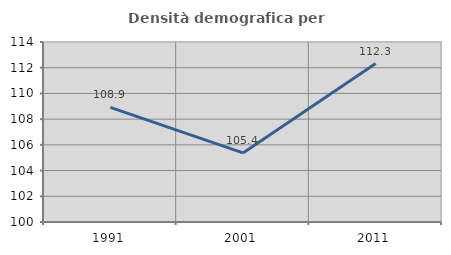
| Category | Densità demografica |
|---|---|
| 1991.0 | 108.913 |
| 2001.0 | 105.374 |
| 2011.0 | 112.322 |